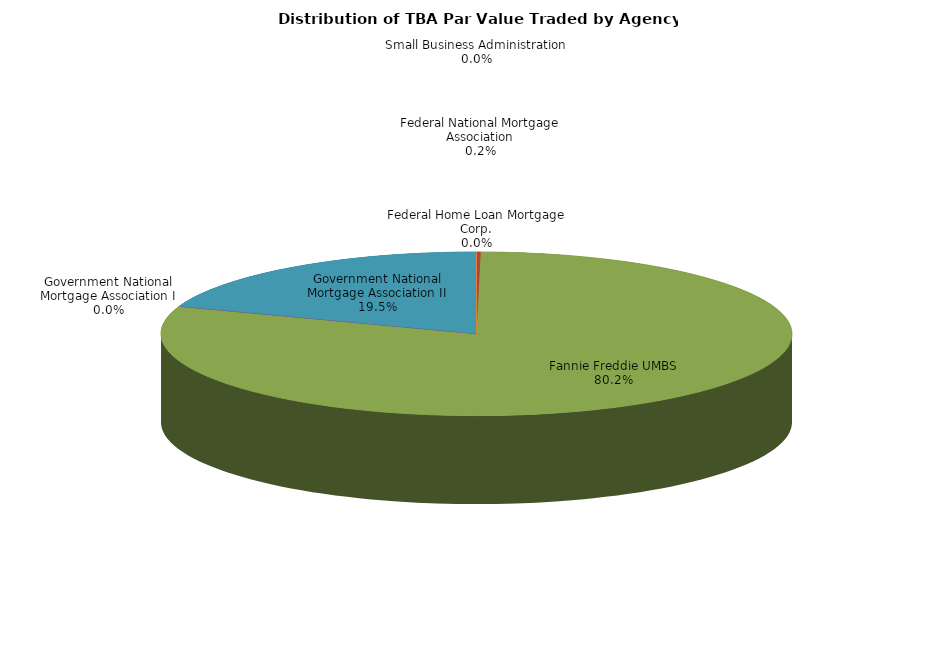
| Category | Series 0 |
|---|---|
| Federal Home Loan Mortgage Corp. | 8584824.633 |
| Federal National Mortgage Association | 470560092.829 |
| Fannie Freddie UMBS | 180077248598.255 |
| Government National Mortgage Association I | 68542681.478 |
| Government National Mortgage Association II | 43888989743.914 |
| Small Business Administration | 12611626.924 |